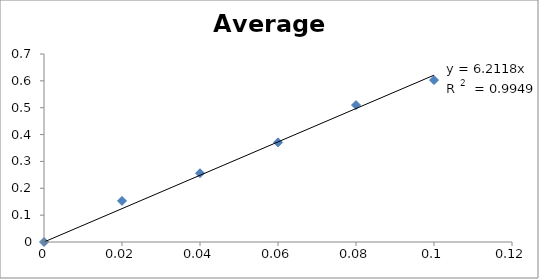
| Category | Average Abs. |
|---|---|
| 0.0 | 0 |
| 0.02 | 0.153 |
| 0.04 | 0.256 |
| 0.06 | 0.371 |
| 0.08 | 0.51 |
| 0.1 | 0.603 |